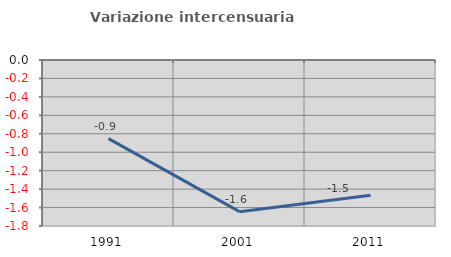
| Category | Variazione intercensuaria annua |
|---|---|
| 1991.0 | -0.853 |
| 2001.0 | -1.645 |
| 2011.0 | -1.467 |